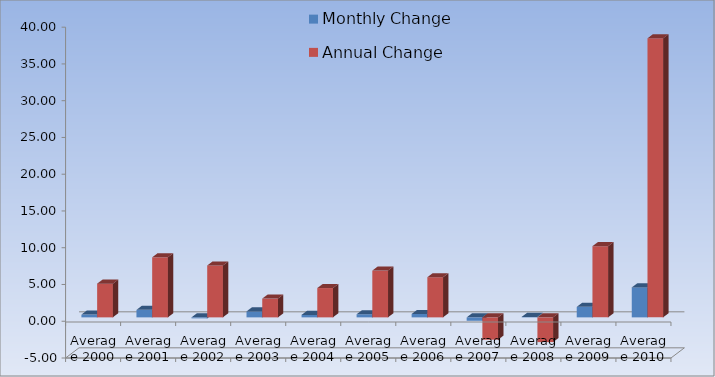
| Category | Monthly Change | Annual Change |
|---|---|---|
| Average 2000 | 0.377 | 4.584 |
| Average 2001 | 1.023 | 8.169 |
| Average 2002 | -0.133 | 7.057 |
| Average 2003 | 0.81 | 2.554 |
| Average 2004 | 0.335 | 3.988 |
| Average 2005 | 0.419 | 6.364 |
| Average 2006 | 0.458 | 5.46 |
| Average 2007 | -0.462 | -3.034 |
| Average 2008 | 0.066 | -3.363 |
| Average 2009 | 1.432 | 9.682 |
| Average 2010 | 4.071 | 37.958 |